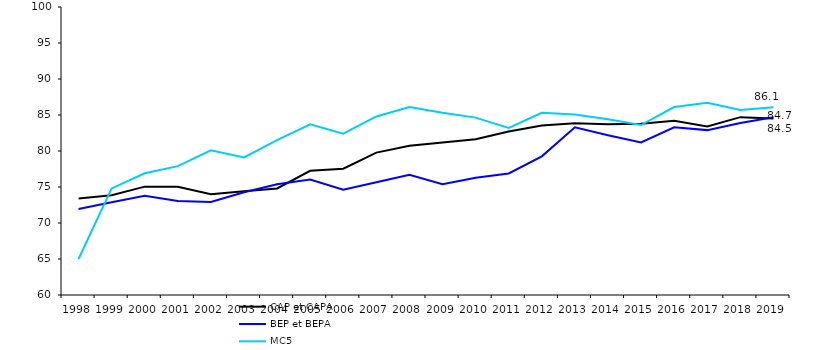
| Category | CAP et CAPA | BEP et BEPA | MC5 |
|---|---|---|---|
| 1998.0 | 73.402 | 71.949 | 65 |
| 1999.0 | 73.869 | 72.873 | 74.8 |
| 2000.0 | 75.049 | 73.797 | 76.9 |
| 2001.0 | 75.03 | 73.047 | 77.9 |
| 2002.0 | 74.009 | 72.923 | 80.1 |
| 2003.0 | 74.408 | 74.269 | 79.1 |
| 2004.0 | 74.799 | 75.39 | 81.5 |
| 2005.0 | 77.242 | 76.029 | 83.7 |
| 2006.0 | 77.539 | 74.614 | 82.4 |
| 2007.0 | 79.773 | 75.663 | 84.8 |
| 2008.0 | 80.734 | 76.696 | 86.1 |
| 2009.0 | 81.187 | 75.39 | 85.3 |
| 2010.0 | 81.622 | 76.295 | 84.636 |
| 2011.0 | 82.716 | 76.886 | 83.2 |
| 2012.0 | 83.548 | 79.261 | 85.3 |
| 2013.0 | 83.838 | 83.295 | 85.084 |
| 2014.0 | 83.7 | 82.2 | 84.4 |
| 2015.0 | 83.8 | 81.2 | 83.6 |
| 2016.0 | 84.2 | 83.3 | 86.1 |
| 2017.0 | 83.4 | 82.9 | 86.7 |
| 2018.0 | 84.7 | 83.9 | 85.7 |
| 2019.0 | 84.5 | 84.7 | 86.063 |